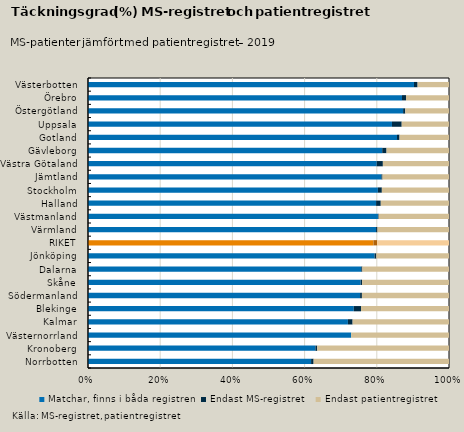
| Category | Matchar, finns i båda registren | Endast MS-registret | Endast patientregistret |
|---|---|---|---|
| Norrbotten | 61.8 | 0.7 | 37.5 |
| Kronoberg | 63 | 0.5 | 36.5 |
| Västernorrland | 72.9 | 0 | 27.1 |
| Kalmar | 72 | 1.3 | 26.7 |
| Blekinge | 73.7 | 2 | 24.4 |
| Södermanland | 75.3 | 0.5 | 24.1 |
| Skåne | 75.6 | 0.4 | 24.1 |
| Dalarna | 75.7 | 0.3 | 24 |
| Jönköping | 79.3 | 0.5 | 20.1 |
| RIKET | 79 | 1 | 19.9 |
| Värmland | 79.8 | 0.4 | 19.8 |
| Västmanland | 80.4 | 0.2 | 19.5 |
| Halland | 79.8 | 1.3 | 18.9 |
| Stockholm | 80.3 | 1.1 | 18.6 |
| Jämtland | 81.2 | 0.3 | 18.4 |
| Västra Götaland | 79.9 | 1.7 | 18.3 |
| Gävleborg | 81.5 | 1.2 | 17.3 |
| Gotland | 85.6 | 0.7 | 13.7 |
| Uppsala | 84.2 | 2.7 | 13.1 |
| Östergötland | 87.2 | 0.6 | 12.1 |
| Örebro | 86.9 | 1.1 | 11.9 |
| Västerbotten | 90.3 | 1 | 8.7 |